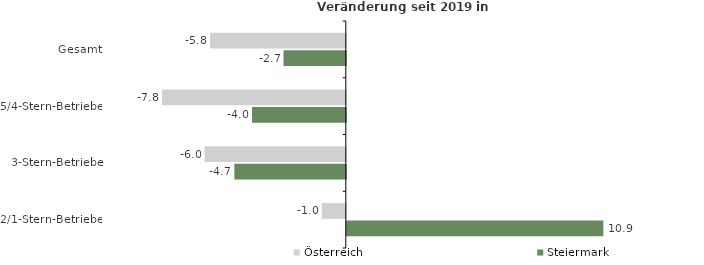
| Category | Österreich | Steiermark |
|---|---|---|
| Gesamt | -5.779 | -2.653 |
| 5/4-Stern-Betriebe | -7.825 | -3.996 |
| 3-Stern-Betriebe | -6.014 | -4.748 |
| 2/1-Stern-Betriebe | -1.021 | 10.926 |